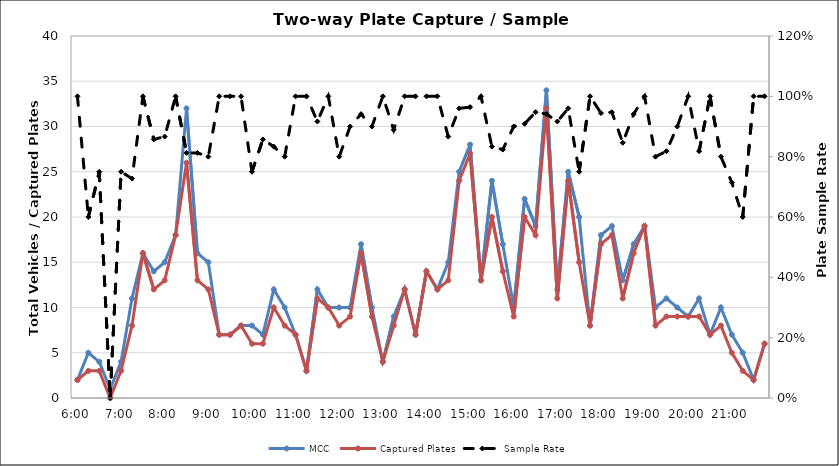
| Category | MCC | Captured Plates |
|---|---|---|
| 0.25 | 2 | 2 |
| 0.260416666666667 | 5 | 3 |
| 0.270833333333333 | 4 | 3 |
| 0.28125 | 1 | 0 |
| 0.291666666666667 | 4 | 3 |
| 0.302083333333333 | 11 | 8 |
| 0.3125 | 16 | 16 |
| 0.322916666666667 | 14 | 12 |
| 0.333333333333333 | 15 | 13 |
| 0.34375 | 18 | 18 |
| 0.354166666666667 | 32 | 26 |
| 0.364583333333333 | 16 | 13 |
| 0.375 | 15 | 12 |
| 0.385416666666667 | 7 | 7 |
| 0.395833333333333 | 7 | 7 |
| 0.40625 | 8 | 8 |
| 0.416666666666667 | 8 | 6 |
| 0.427083333333333 | 7 | 6 |
| 0.4375 | 12 | 10 |
| 0.447916666666667 | 10 | 8 |
| 0.458333333333333 | 7 | 7 |
| 0.46875 | 3 | 3 |
| 0.479166666666667 | 12 | 11 |
| 0.489583333333333 | 10 | 10 |
| 0.5 | 10 | 8 |
| 0.510416666666667 | 10 | 9 |
| 0.520833333333333 | 17 | 16 |
| 0.53125 | 10 | 9 |
| 0.541666666666667 | 4 | 4 |
| 0.552083333333333 | 9 | 8 |
| 0.5625 | 12 | 12 |
| 0.572916666666667 | 7 | 7 |
| 0.583333333333333 | 14 | 14 |
| 0.59375 | 12 | 12 |
| 0.604166666666667 | 15 | 13 |
| 0.614583333333333 | 25 | 24 |
| 0.625 | 28 | 27 |
| 0.635416666666667 | 13 | 13 |
| 0.645833333333333 | 24 | 20 |
| 0.65625 | 17 | 14 |
| 0.666666666666667 | 10 | 9 |
| 0.677083333333333 | 22 | 20 |
| 0.6875 | 19 | 18 |
| 0.697916666666667 | 34 | 32 |
| 0.708333333333333 | 12 | 11 |
| 0.71875 | 25 | 24 |
| 0.729166666666667 | 20 | 15 |
| 0.739583333333333 | 8 | 8 |
| 0.75 | 18 | 17 |
| 0.760416666666667 | 19 | 18 |
| 0.770833333333333 | 13 | 11 |
| 0.78125 | 17 | 16 |
| 0.791666666666667 | 19 | 19 |
| 0.802083333333333 | 10 | 8 |
| 0.8125 | 11 | 9 |
| 0.822916666666667 | 10 | 9 |
| 0.833333333333333 | 9 | 9 |
| 0.84375 | 11 | 9 |
| 0.854166666666667 | 7 | 7 |
| 0.864583333333333 | 10 | 8 |
| 0.875 | 7 | 5 |
| 0.885416666666667 | 5 | 3 |
| 0.895833333333333 | 2 | 2 |
| 0.90625 | 6 | 6 |